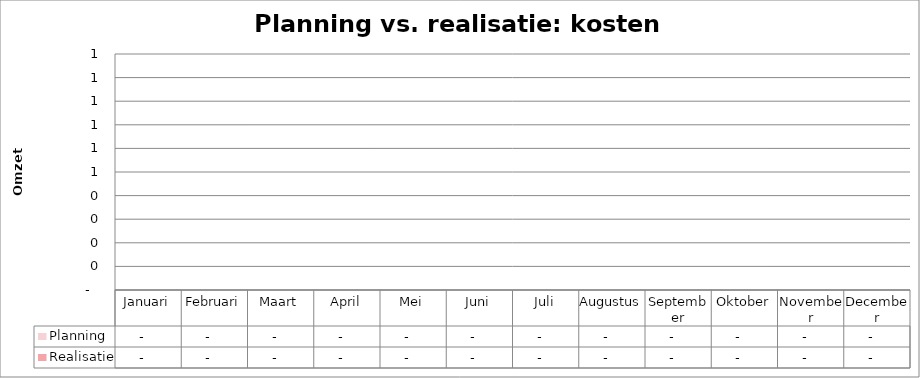
| Category | Planning | Realisatie |
|---|---|---|
| Januari | 0 | 0 |
| Februari | 0 | 0 |
| Maart | 0 | 0 |
| April | 0 | 0 |
| Mei | 0 | 0 |
| Juni | 0 | 0 |
| Juli | 0 | 0 |
| Augustus | 0 | 0 |
| September | 0 | 0 |
| Oktober | 0 | 0 |
| November | 0 | 0 |
| December | 0 | 0 |